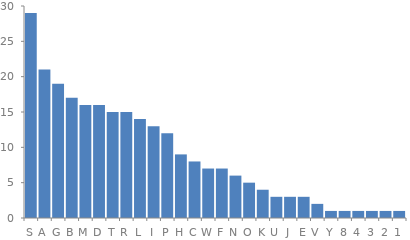
| Category | Count |
|---|---|
| S | 29 |
| A | 21 |
| G | 19 |
| B | 17 |
| M | 16 |
| D | 16 |
| T | 15 |
| R | 15 |
| L | 14 |
| I | 13 |
| P | 12 |
| H | 9 |
| C | 8 |
| W | 7 |
| F | 7 |
| N | 6 |
| O | 5 |
| K | 4 |
| U | 3 |
| J | 3 |
| E | 3 |
| V | 2 |
| Y | 1 |
| 8 | 1 |
| 4 | 1 |
| 3 | 1 |
| 2 | 1 |
| 1 | 1 |